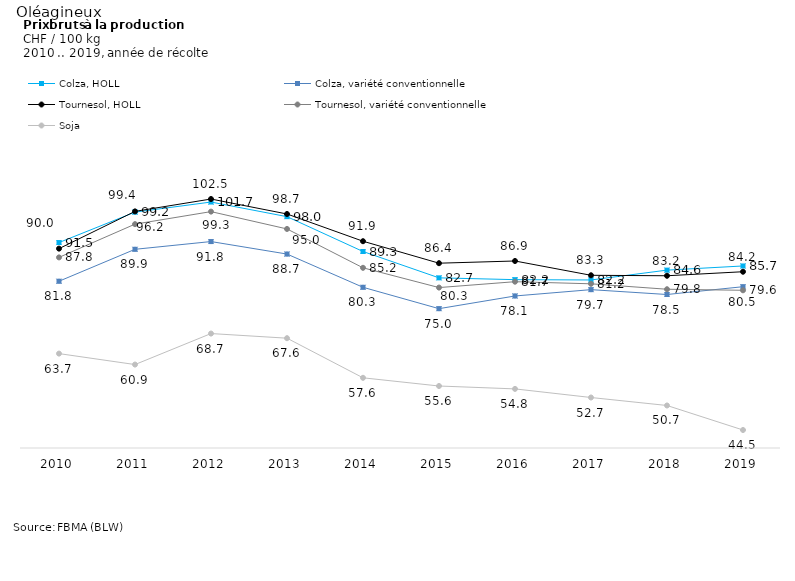
| Category | Colza, HOLL | Colza, variété conventionnelle | Tournesol, HOLL | Tournesol, variété conventionnelle | Soja |
|---|---|---|---|---|---|
| 2010.0 | 91.547 | 81.84 | 90.022 | 87.824 | 63.685 |
| 2011.0 | 99.18 | 89.854 | 99.367 | 96.165 | 60.937 |
| 2012.0 | 101.712 | 91.796 | 102.469 | 99.308 | 68.713 |
| 2013.0 | 98.04 | 88.661 | 98.71 | 94.96 | 67.55 |
| 2014.0 | 89.3 | 80.32 | 91.88 | 85.21 | 57.61 |
| 2015.0 | 82.688 | 74.959 | 86.368 | 80.251 | 55.555 |
| 2016.0 | 82.24 | 78.143 | 86.919 | 81.725 | 54.829 |
| 2017.0 | 82.155 | 79.731 | 83.334 | 81.197 | 52.67 |
| 2018.0 | 84.629 | 78.509 | 83.215 | 79.83 | 50.665 |
| 2019.0 | 85.673 | 80.468 | 84.225 | 79.569 | 44.515 |